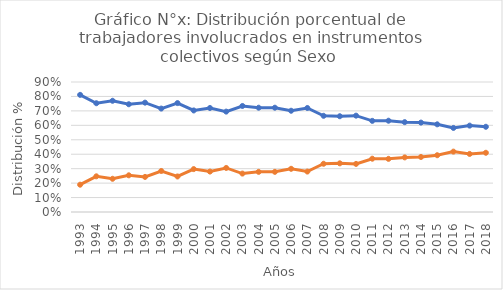
| Category | Hombres  | Mujeres  |
|---|---|---|
| 1993.0 | 0.811 | 0.189 |
| 1994.0 | 0.753 | 0.247 |
| 1995.0 | 0.77 | 0.23 |
| 1996.0 | 0.746 | 0.254 |
| 1997.0 | 0.757 | 0.243 |
| 1998.0 | 0.716 | 0.284 |
| 1999.0 | 0.754 | 0.246 |
| 2000.0 | 0.703 | 0.297 |
| 2001.0 | 0.72 | 0.28 |
| 2002.0 | 0.695 | 0.305 |
| 2003.0 | 0.734 | 0.266 |
| 2004.0 | 0.722 | 0.278 |
| 2005.0 | 0.722 | 0.278 |
| 2006.0 | 0.701 | 0.299 |
| 2007.0 | 0.72 | 0.28 |
| 2008.0 | 0.666 | 0.334 |
| 2009.0 | 0.663 | 0.337 |
| 2010.0 | 0.667 | 0.333 |
| 2011.0 | 0.631 | 0.369 |
| 2012.0 | 0.632 | 0.368 |
| 2013.0 | 0.622 | 0.378 |
| 2014.0 | 0.619 | 0.381 |
| 2015.0 | 0.607 | 0.393 |
| 2016.0 | 0.582 | 0.418 |
| 2017.0 | 0.598 | 0.402 |
| 2018.0 | 0.59 | 0.41 |